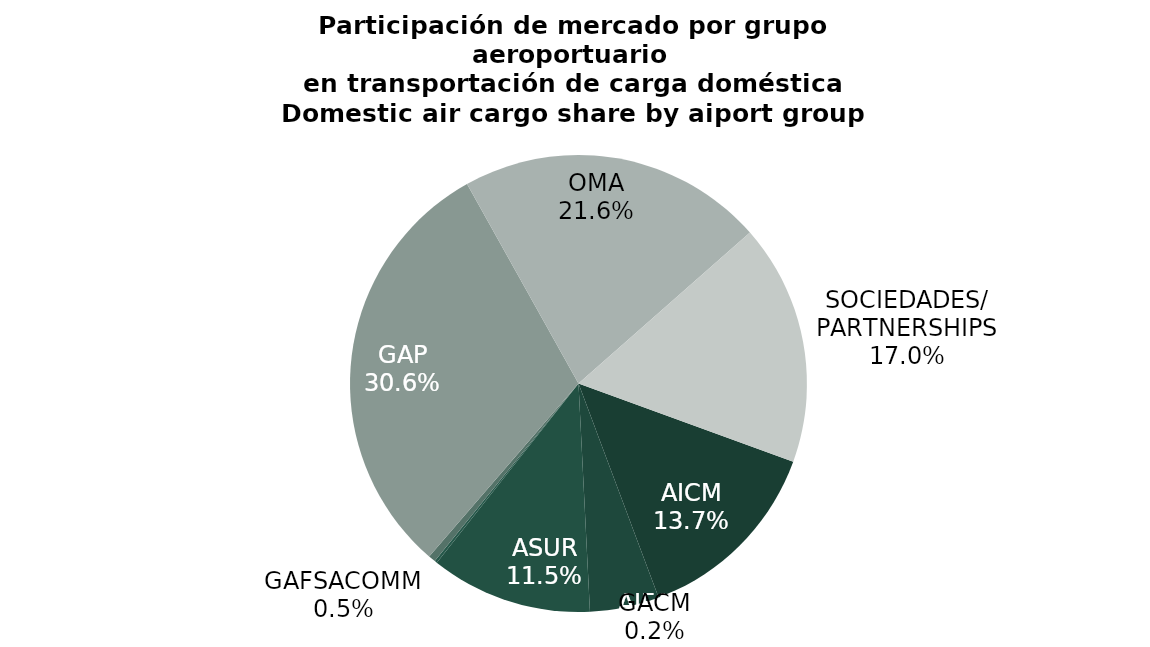
| Category | Series 0 |
|---|---|
| AICM | 4107.3 |
| AIFA | 1465.432 |
| ASUR | 3422.356 |
| GACM | 53.191 |
| GAFSACOMM | 151.697 |
| GAP | 9131.125 |
| OMA | 6461.394 |
| SOCIEDADES/
PARTNERSHIPS | 5095.329 |